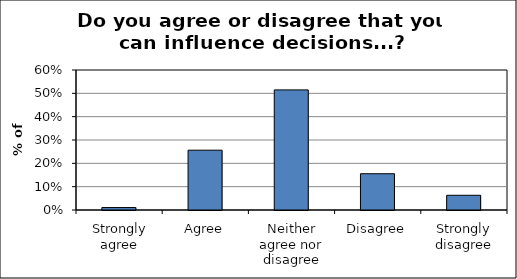
| Category | Series 0 |
|---|---|
| Strongly agree | 0.011 |
| Agree | 0.256 |
| Neither agree nor disagree | 0.515 |
| Disagree | 0.155 |
| Strongly disagree | 0.063 |